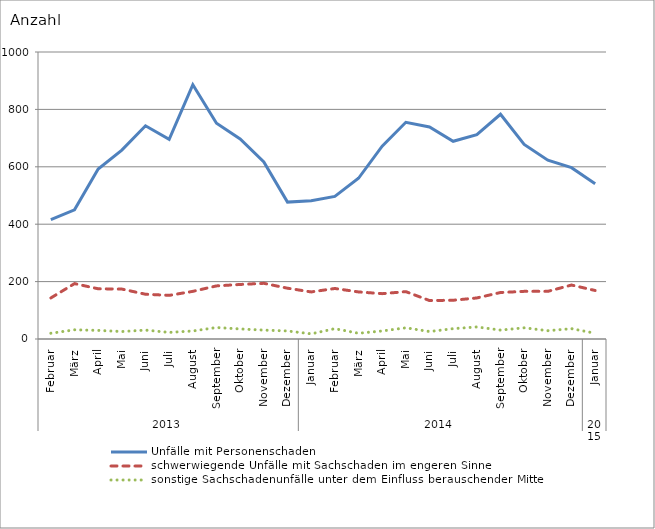
| Category | Unfälle mit Personenschaden | schwerwiegende Unfälle mit Sachschaden im engeren Sinne | sonstige Sachschadenunfälle unter dem Einfluss berauschender Mittel |
|---|---|---|---|
| 0 | 416 | 143 | 20 |
| 1 | 450 | 193 | 32 |
| 2 | 592 | 175 | 30 |
| 3 | 658 | 174 | 26 |
| 4 | 743 | 156 | 31 |
| 5 | 696 | 152 | 23 |
| 6 | 886 | 166 | 28 |
| 7 | 752 | 185 | 40 |
| 8 | 697 | 190 | 35 |
| 9 | 617 | 194 | 31 |
| 10 | 477 | 177 | 28 |
| 11 | 482 | 164 | 18 |
| 12 | 497 | 176 | 36 |
| 13 | 560 | 164 | 20 |
| 14 | 672 | 158 | 28 |
| 15 | 755 | 165 | 39 |
| 16 | 739 | 134 | 26 |
| 17 | 689 | 135 | 36 |
| 18 | 712 | 143 | 42 |
| 19 | 783 | 162 | 31 |
| 20 | 678 | 166 | 39 |
| 21 | 623 | 166 | 29 |
| 22 | 597 | 188 | 36 |
| 23 | 541 | 169 | 20 |